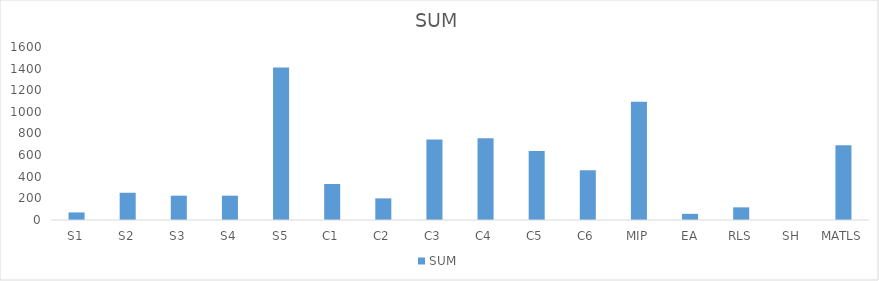
| Category | SUM |
|---|---|
| S1 | 70 |
| S2 | 252 |
| S3 | 225 |
| S4 | 225 |
| S5 | 1411 |
| C1 | 333 |
| C2 | 200 |
| C3 | 745 |
| C4 | 755 |
| C5 | 637 |
| C6 | 460 |
| MIP | 1094 |
| EA | 57 |
| RLS | 117 |
| SH | 0 |
| MATLS | 691 |